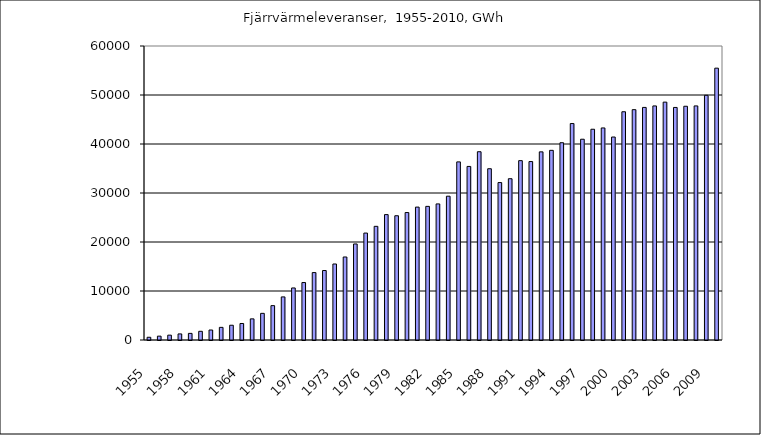
| Category | 557 |
|---|---|
| 0 | 556.9 |
| 1 | 786.8 |
| 2 | 990.6 |
| 3 | 1240.7 |
| 4 | 1349.7 |
| 5 | 1774.5 |
| 6 | 2038.3 |
| 7 | 2578.3 |
| 8 | 3012.2 |
| 9 | 3368.1 |
| 10 | 4312.7 |
| 11 | 5438 |
| 12 | 7014 |
| 13 | 8793.1 |
| 14 | 10621 |
| 15 | 11725 |
| 16 | 13759 |
| 17 | 14179 |
| 18 | 15512 |
| 19 | 16939.7 |
| 20 | 19598.3 |
| 21 | 21821.2 |
| 22 | 23198 |
| 23 | 25591 |
| 24 | 25359 |
| 25 | 26010.7 |
| 26 | 27122 |
| 27 | 27273 |
| 28 | 27773 |
| 29 | 29348 |
| 30 | 36352 |
| 31 | 35421 |
| 32 | 38424 |
| 33 | 34953 |
| 34 | 32130 |
| 35 | 32916 |
| 36 | 36605 |
| 37 | 36416.7 |
| 38 | 38395.899 |
| 39 | 38707.254 |
| 40 | 40259.516 |
| 41 | 44174 |
| 42 | 40975 |
| 43 | 43012 |
| 44 | 43278 |
| 45 | 41425 |
| 46 | 46580 |
| 47 | 47008 |
| 48 | 47468.061 |
| 49 | 47768 |
| 50 | 48543 |
| 51 | 47460.083 |
| 52 | 47701.205 |
| 53 | 47774.164 |
| 54 | 49939.044 |
| 55 | 55477.855 |